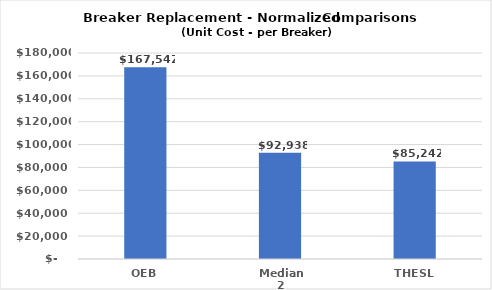
| Category | Series 0 |
|---|---|
| OEB | 167542 |
| Median 2 | 92937.564 |
| THESL | 85242 |